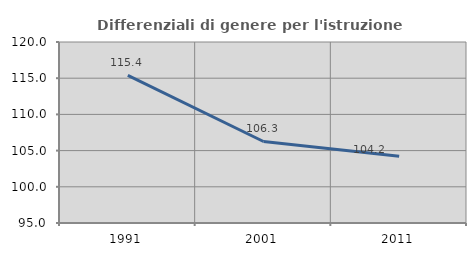
| Category | Differenziali di genere per l'istruzione superiore |
|---|---|
| 1991.0 | 115.403 |
| 2001.0 | 106.258 |
| 2011.0 | 104.219 |